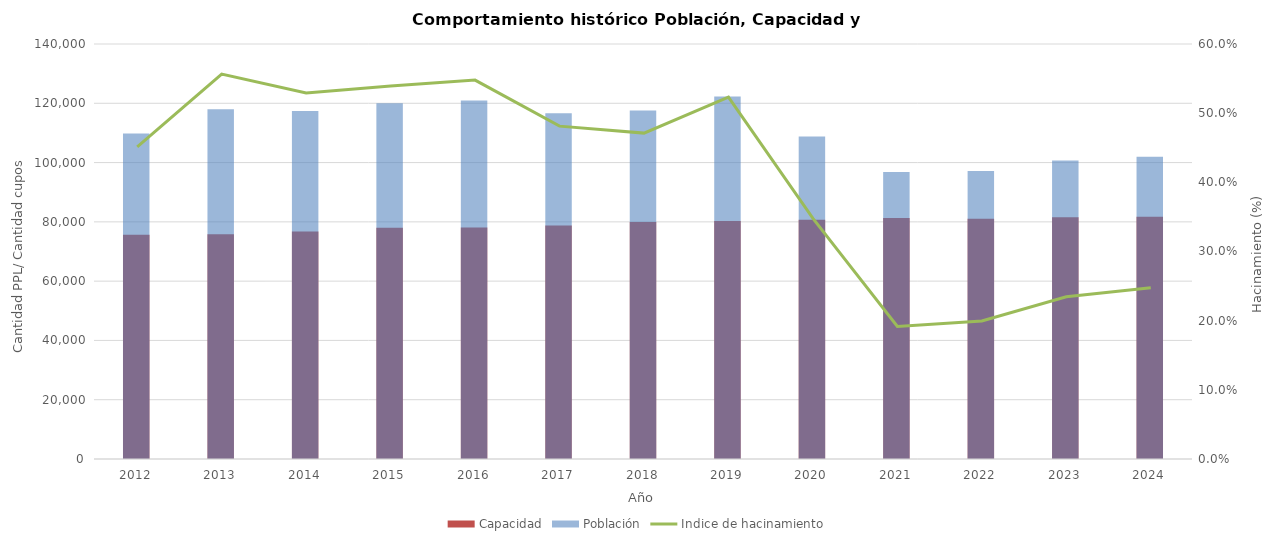
| Category | Capacidad | Población |
|---|---|---|
| 2012.0 | 75679.167 | 109822.083 |
| 2013.0 | 75796.583 | 117986.5 |
| 2014.0 | 76777 | 117389.083 |
| 2015.0 | 77979.75 | 120040.083 |
| 2016.0 | 78119.5 | 120914 |
| 2017.0 | 78759 | 116657.667 |
| 2018.0 | 79914 | 117569.583 |
| 2019.0 | 80296.167 | 122309.5 |
| 2020.0 | 80704.167 | 108777.75 |
| 2021.0 | 81268.833 | 96837.5 |
| 2022.0 | 81010.417 | 97175.917 |
| 2023.0 | 81594 | 100737.75 |
| 2024.0 | 81747.25 | 101986.5 |